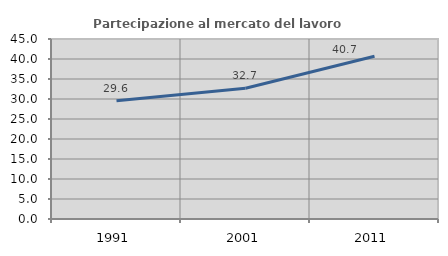
| Category | Partecipazione al mercato del lavoro  femminile |
|---|---|
| 1991.0 | 29.576 |
| 2001.0 | 32.698 |
| 2011.0 | 40.678 |